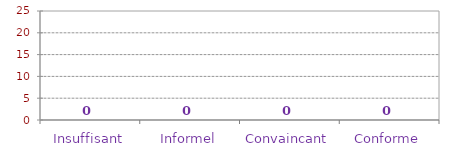
| Category | Conformités |
|---|---|
| Insuffisant | 0 |
| Informel | 0 |
| Convaincant | 0 |
| Conforme | 0 |